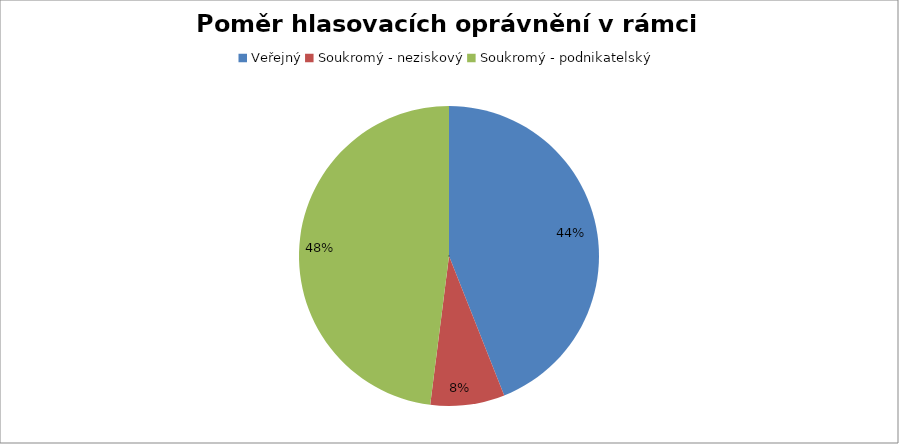
| Category | Series 0 |
|---|---|
| Veřejný | 0.44 |
| Soukromý - neziskový | 0.08 |
| Soukromý - podnikatelský | 0.48 |